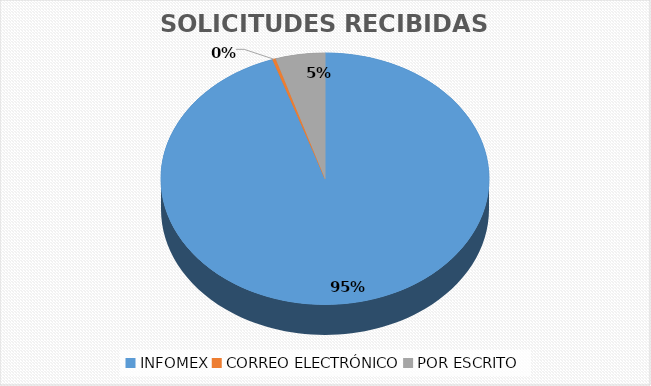
| Category | Series 0 |
|---|---|
| INFOMEX | 1167 |
| CORREO ELECTRÓNICO | 4 |
| POR ESCRITO | 60 |